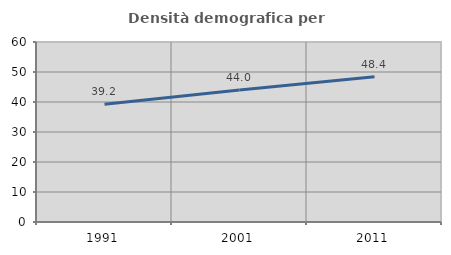
| Category | Densità demografica |
|---|---|
| 1991.0 | 39.236 |
| 2001.0 | 44.017 |
| 2011.0 | 48.408 |